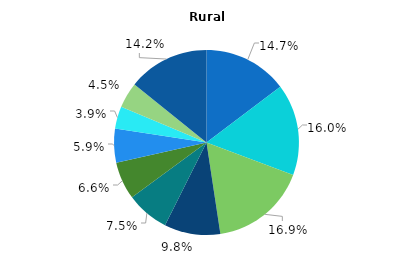
| Category | Series 0 |
|---|---|
| 0 | 14.7 |
| 1 | 16 |
| 2 | 16.9 |
| 3 | 9.8 |
| 4 | 7.5 |
| 5 | 6.6 |
| 6 | 5.9 |
| 7 | 3.9 |
| 8 | 4.5 |
| 9 | 14.2 |